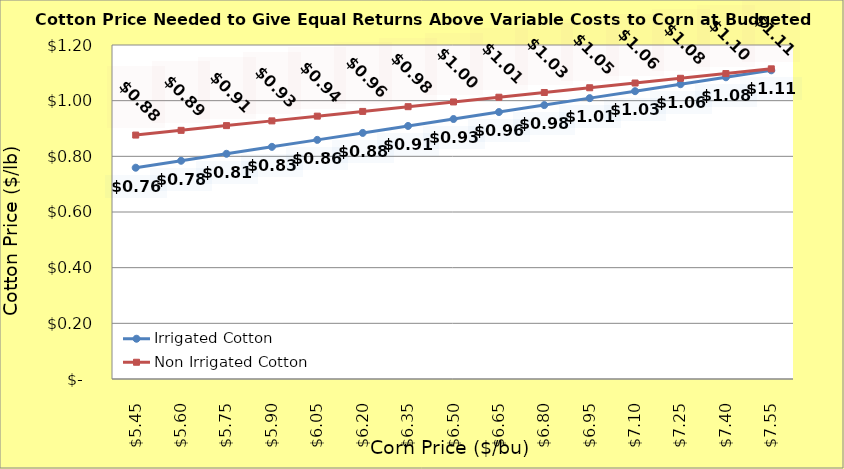
| Category | Irrigated Cotton | Non Irrigated Cotton |
|---|---|---|
| 5.4499999999999975 | 0.759 | 0.876 |
| 5.599999999999998 | 0.784 | 0.893 |
| 5.749999999999998 | 0.809 | 0.91 |
| 5.899999999999999 | 0.834 | 0.927 |
| 6.049999999999999 | 0.859 | 0.944 |
| 6.199999999999999 | 0.884 | 0.961 |
| 6.35 | 0.909 | 0.978 |
| 6.5 | 0.934 | 0.995 |
| 6.65 | 0.959 | 1.012 |
| 6.800000000000001 | 0.984 | 1.029 |
| 6.950000000000001 | 1.009 | 1.046 |
| 7.100000000000001 | 1.034 | 1.063 |
| 7.250000000000002 | 1.059 | 1.08 |
| 7.400000000000002 | 1.084 | 1.097 |
| 7.5500000000000025 | 1.109 | 1.114 |